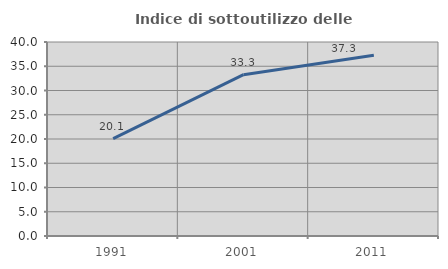
| Category | Indice di sottoutilizzo delle abitazioni  |
|---|---|
| 1991.0 | 20.063 |
| 2001.0 | 33.256 |
| 2011.0 | 37.275 |